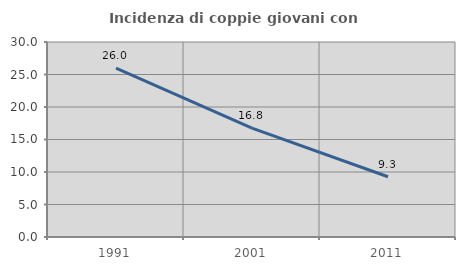
| Category | Incidenza di coppie giovani con figli |
|---|---|
| 1991.0 | 25.996 |
| 2001.0 | 16.761 |
| 2011.0 | 9.268 |